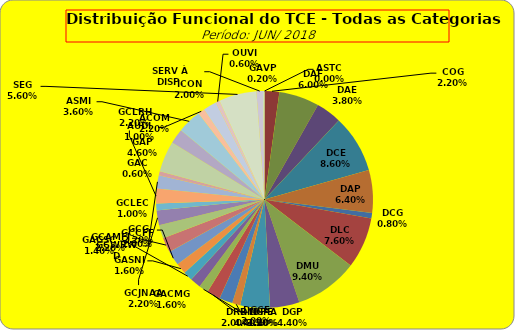
| Category | ASTC |
|---|---|
| ASTC | 0 |
| COG | 11 |
| DAF | 30 |
| DAE | 19 |
| DCE | 43 |
| DAP | 32 |
| DCG | 4 |
| DLC | 38 |
| DMU | 47 |
| DGP | 22 |
| DIN | 22 |
| DPE | 6 |
| DRR | 10 |
| DGCE | 10 |
| DGPA | 7 |
| GACMG | 8 |
| GAGSC | 7 |
| GASNI | 8 |
| GCG | 11 |
| GCAMFJ | 11 |
| GCCFF | 10 |
| GCJNAA | 11 |
| GCLEC | 5 |
| GCLRH | 11 |
| GCWRWD | 10 |
| GAC | 3 |
| GAP | 23 |
| ACOM | 11 |
| ASMI | 18 |
| AUDI | 5 |
| ICON | 10 |
| OUVI | 3 |
| SEG | 28 |
| SERV À DISP. | 5 |
| GAVP | 1 |